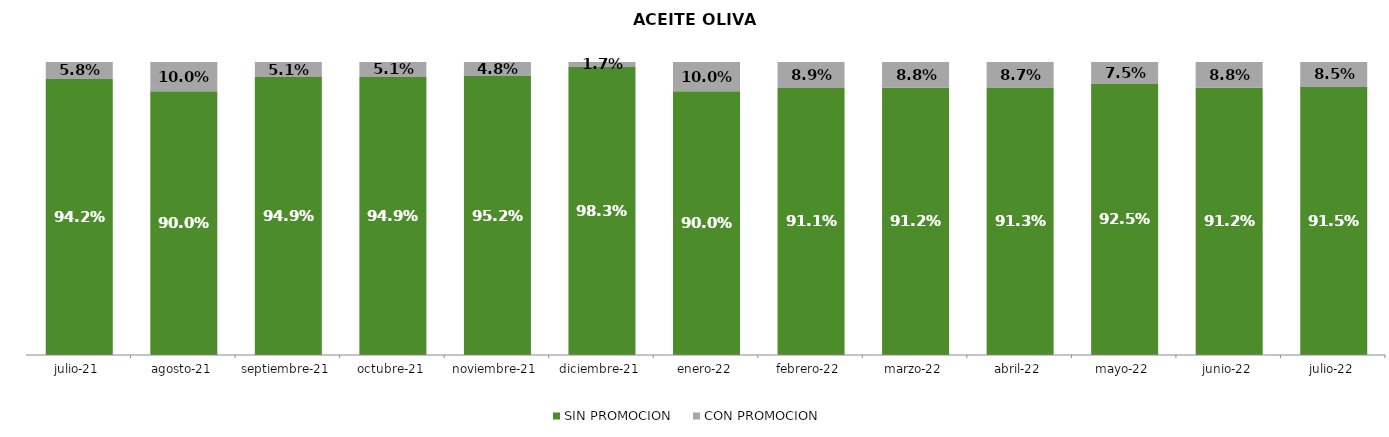
| Category | SIN PROMOCION   | CON PROMOCION   |
|---|---|---|
| 2021-07-01 | 0.942 | 0.058 |
| 2021-08-01 | 0.9 | 0.1 |
| 2021-09-01 | 0.949 | 0.051 |
| 2021-10-01 | 0.949 | 0.051 |
| 2021-11-01 | 0.952 | 0.048 |
| 2021-12-01 | 0.983 | 0.017 |
| 2022-01-01 | 0.9 | 0.1 |
| 2022-02-01 | 0.911 | 0.089 |
| 2022-03-01 | 0.912 | 0.088 |
| 2022-04-01 | 0.913 | 0.087 |
| 2022-05-01 | 0.925 | 0.075 |
| 2022-06-01 | 0.912 | 0.088 |
| 2022-07-01 | 0.915 | 0.085 |